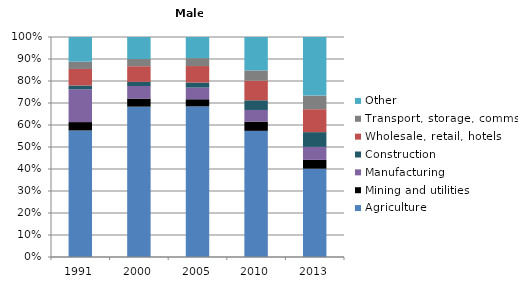
| Category | Agriculture | Mining and utilities | Manufacturing | Construction | Wholesale, retail, hotels | Transport, storage, comms | Other |
|---|---|---|---|---|---|---|---|
| 1991.0 | 57.4 | 3.8 | 14.9 | 1.7 | 7.5 | 3.3 | 11.2 |
| 2000.0 | 68.4 | 3.7 | 5.7 | 1.9 | 7.1 | 3.3 | 10 |
| 2005.0 | 68.5 | 3.2 | 5.3 | 2.3 | 7.5 | 3.6 | 9.6 |
| 2010.0 | 57.4 | 4.2 | 5.3 | 4.4 | 8.9 | 4.7 | 15.2 |
| 2013.0 | 40.1 | 4 | 5.9 | 6.7 | 10.4 | 6.2 | 26.6 |